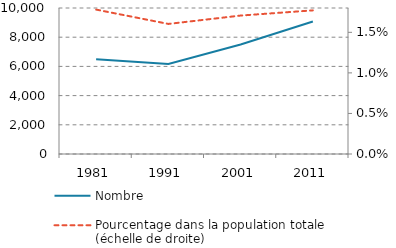
| Category | Nombre |
|---|---|
| 1981.0 | 6491 |
| 1991.0 | 6168 |
| 2001.0 | 7502 |
| 2011.0 | 9073 |